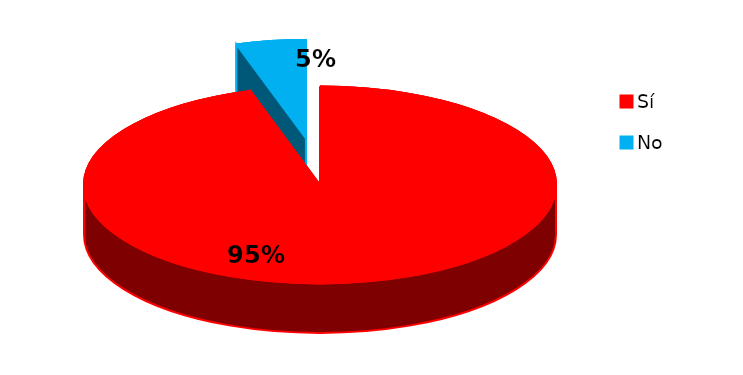
| Category | Series 0 |
|---|---|
| 0 | 40 |
| 1 | 2 |